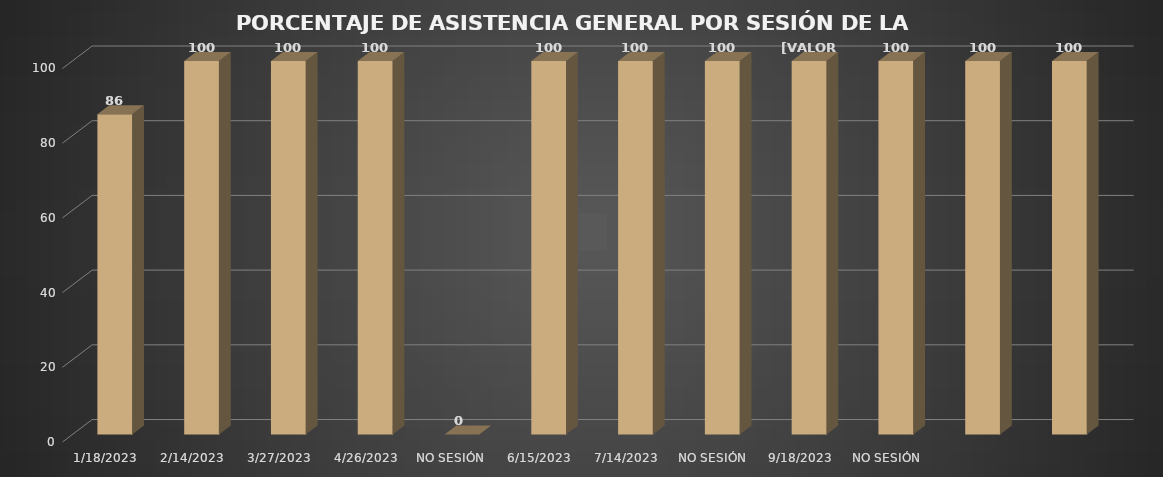
| Category | Series 0 |
|---|---|
| 18/01/2023 | 85.714 |
| 14/02/2023 | 100 |
| 27/03/2023 | 100 |
| 26/04/2023 | 100 |
| NO SESIÓN  | 0 |
| 15/06/2023 | 100 |
| 14/07/2023 | 100 |
| NO SESIÓN | 100 |
| 18/09/2023 | 100 |
| NO SESIÓN | 100 |